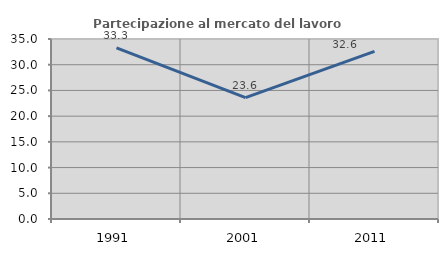
| Category | Partecipazione al mercato del lavoro  femminile |
|---|---|
| 1991.0 | 33.257 |
| 2001.0 | 23.606 |
| 2011.0 | 32.592 |